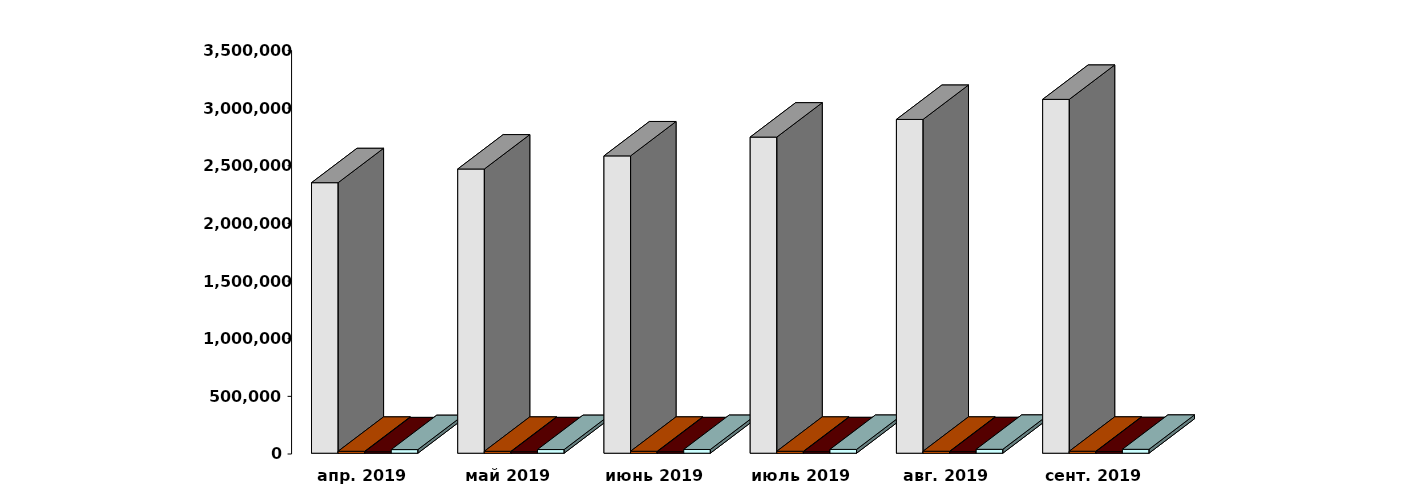
| Category | Физические лица | Юридические лица | Иностранные лица | Клиенты, передавшие свои средства в ДУ |
|---|---|---|---|---|
| 2019-04-01 | 2345873 | 16794 | 12185 | 31398 |
| 2019-05-01 | 2464521 | 16758 | 12375 | 31803 |
| 2019-06-01 | 2578398 | 16818 | 12464 | 32273 |
| 2019-07-01 | 2741361 | 16917 | 12726 | 33008 |
| 2019-08-01 | 2894450 | 17007 | 12945 | 33858 |
| 2019-09-30 | 3068547 | 17183 | 13213 | 33842 |